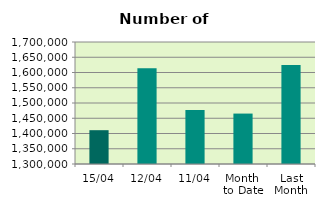
| Category | Series 0 |
|---|---|
| 15/04 | 1410868 |
| 12/04 | 1614158 |
| 11/04 | 1476916 |
| Month 
to Date | 1465345.455 |
| Last
Month | 1624932.286 |